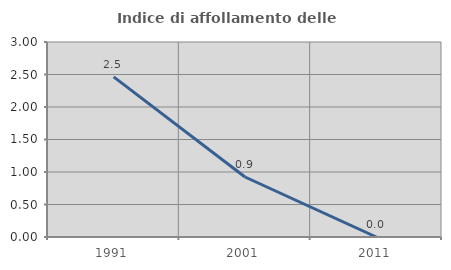
| Category | Indice di affollamento delle abitazioni  |
|---|---|
| 1991.0 | 2.464 |
| 2001.0 | 0.923 |
| 2011.0 | 0 |